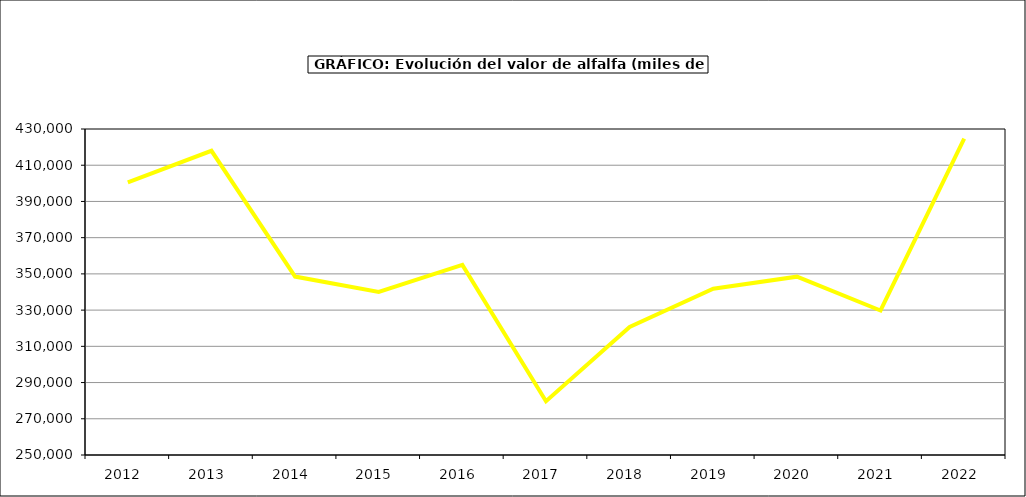
| Category | Valor |
|---|---|
| 2012.0 | 400520.754 |
| 2013.0 | 417975.354 |
| 2014.0 | 348510.593 |
| 2015.0 | 340064 |
| 2016.0 | 354947 |
| 2017.0 | 279674.885 |
| 2018.0 | 320740.744 |
| 2019.0 | 341773.556 |
| 2020.0 | 348475.357 |
| 2021.0 | 329796.045 |
| 2022.0 | 424705.143 |